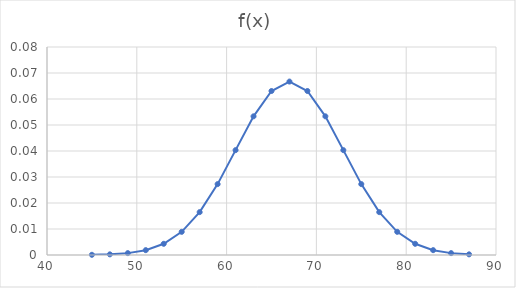
| Category | f(x) |
|---|---|
| 45.0 | 0 |
| 47.0 | 0 |
| 49.0 | 0.001 |
| 51.0 | 0.002 |
| 53.0 | 0.004 |
| 55.0 | 0.009 |
| 57.0 | 0.016 |
| 59.0 | 0.027 |
| 61.0 | 0.04 |
| 63.0 | 0.053 |
| 65.0 | 0.063 |
| 67.0 | 0.067 |
| 69.0 | 0.063 |
| 71.0 | 0.053 |
| 73.0 | 0.04 |
| 75.0 | 0.027 |
| 77.0 | 0.016 |
| 79.0 | 0.009 |
| 81.0 | 0.004 |
| 83.0 | 0.002 |
| 85.0 | 0.001 |
| 87.0 | 0 |